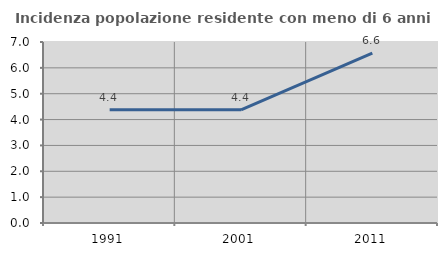
| Category | Incidenza popolazione residente con meno di 6 anni |
|---|---|
| 1991.0 | 4.375 |
| 2001.0 | 4.376 |
| 2011.0 | 6.572 |